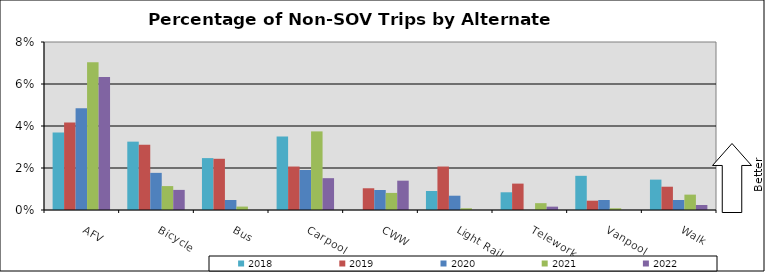
| Category | 2018 | 2019 | 2020 | 2021 | 2022 |
|---|---|---|---|---|---|
| AFV | 0.037 | 0.042 | 0.049 | 0.07 | 0.063 |
| Bicycle | 0.033 | 0.031 | 0.018 | 0.011 | 0.01 |
| Bus | 0.025 | 0.024 | 0.005 | 0.002 | 0 |
| Carpool | 0.035 | 0.021 | 0.019 | 0.037 | 0.015 |
| CWW | 0 | 0.01 | 0.01 | 0.008 | 0.014 |
| Light Rail | 0.009 | 0.021 | 0.007 | 0.001 | 0 |
| Telework | 0.008 | 0.013 | 0 | 0.003 | 0.002 |
| Vanpool | 0.016 | 0.004 | 0.005 | 0.001 | 0 |
| Walk | 0.014 | 0.011 | 0.005 | 0.007 | 0.002 |